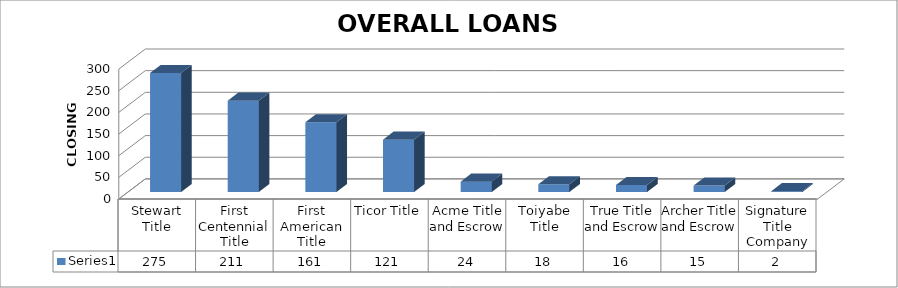
| Category | Series 0 |
|---|---|
| Stewart Title | 275 |
| First Centennial Title | 211 |
| First American Title | 161 |
| Ticor Title | 121 |
| Acme Title and Escrow | 24 |
| Toiyabe Title | 18 |
| True Title and Escrow | 16 |
| Archer Title and Escrow | 15 |
| Signature Title Company | 2 |